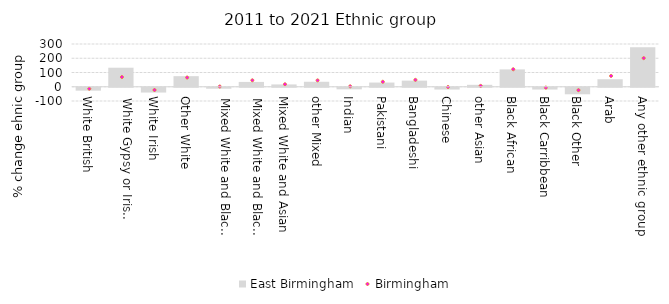
| Category | East Birmingham |
|---|---|
| White British | -20.356 |
| White Gypsy or Irish Traveller | 133.621 |
| White Irish | -33.61 |
| Other White | 74.264 |
| Mixed White and Black Caribbean | -6.645 |
| Mixed White and Black African | 33.741 |
| Mixed White and Asian | 16.318 |
| other Mixed | 34.921 |
| Indian | -11.152 |
| Pakistani | 29.371 |
| Bangladeshi | 42.897 |
| Chinese | -12.581 |
| other Asian | 13.518 |
| Black African | 121.796 |
| Black Carribbean | -12.642 |
| Black Other | -45.824 |
| Arab | 52.744 |
| Any other ethnic group | 277.146 |